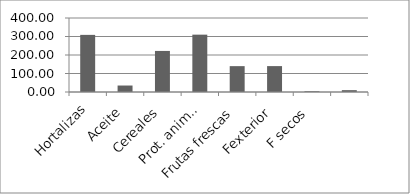
| Category | Series 0 |
|---|---|
| Hortalizas | 308.79 |
| Aceite | 35 |
| Cereales | 222 |
| Prot. animal | 310 |
| Frutas frescas | 139.8 |
| Fexterior | 140 |
|      F secos | 4 |